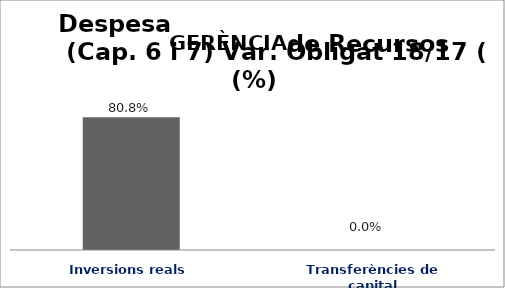
| Category | Series 0 |
|---|---|
| Inversions reals | 0.808 |
| Transferències de capital | 0 |